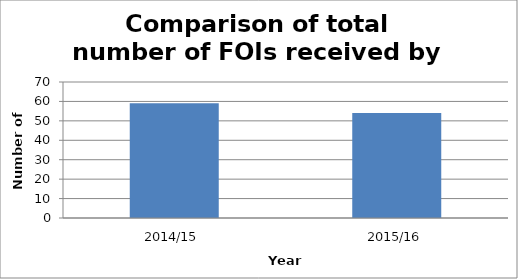
| Category | Series 0 |
|---|---|
| 2014/15 | 59 |
| 2015/16 | 54 |